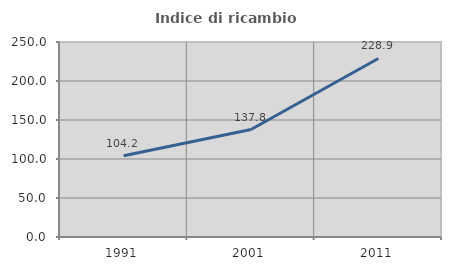
| Category | Indice di ricambio occupazionale  |
|---|---|
| 1991.0 | 104.236 |
| 2001.0 | 137.785 |
| 2011.0 | 228.901 |